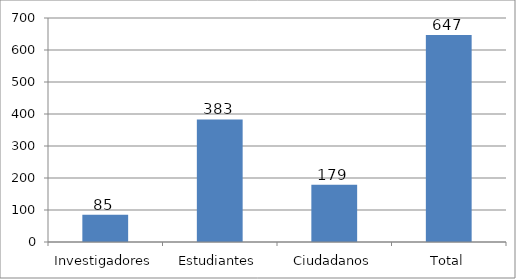
| Category | Series 0 |
|---|---|
| Investigadores | 85 |
| Estudiantes | 383 |
| Ciudadanos | 179 |
| Total | 647 |